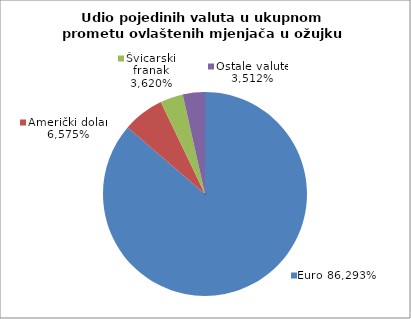
| Category | EUR |
|---|---|
| 0 | 0.863 |
| 1 | 0.066 |
| 2 | 0.036 |
| 3 | 0.035 |